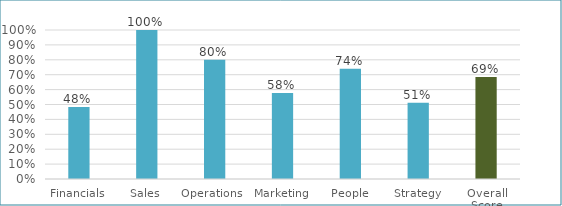
| Category | Series 0 |
|---|---|
| Financials | 0.483 |
| Sales | 1 |
| Operations  | 0.8 |
| Marketing | 0.578 |
| People | 0.74 |
| Strategy | 0.511 |
| Overall Score | 0.685 |